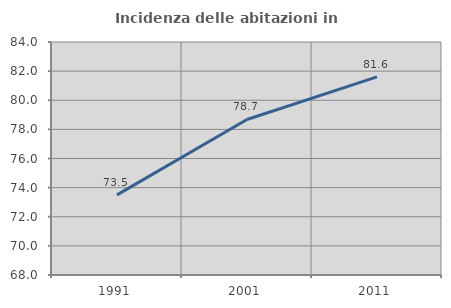
| Category | Incidenza delle abitazioni in proprietà  |
|---|---|
| 1991.0 | 73.5 |
| 2001.0 | 78.68 |
| 2011.0 | 81.606 |